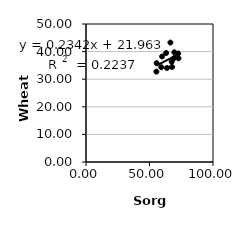
| Category | Series 0 |
|---|---|
| 67.74435384948409 | 34.428 |
| 69.39597379166271 | 37.674 |
| 63.77858880778589 | 34.07 |
| 55.428262631721154 | 32.748 |
| 63.076576080977006 | 39.498 |
| 59.25633232016211 | 34.333 |
| 72.6159336099585 | 39.305 |
| 59.91161956034096 | 38.213 |
| 72.80542783447348 | 37.575 |
| 55.61403720705484 | 35.812 |
| 67.47113687925385 | 36.314 |
| 69.54594824832286 | 39.74 |
| 66.46861444245981 | 43.265 |